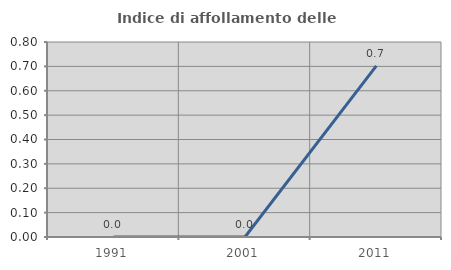
| Category | Indice di affollamento delle abitazioni  |
|---|---|
| 1991.0 | 0 |
| 2001.0 | 0 |
| 2011.0 | 0.702 |